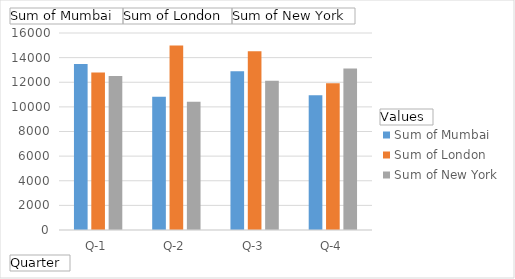
| Category | Sum of Mumbai | Sum of London | Sum of New York |
|---|---|---|---|
| Q-1 | 13476 | 12800 | 12498 |
| Q-2 | 10822 | 14986 | 10412 |
| Q-3 | 12902 | 14511 | 12119 |
| Q-4 | 10935 | 11914 | 13122 |